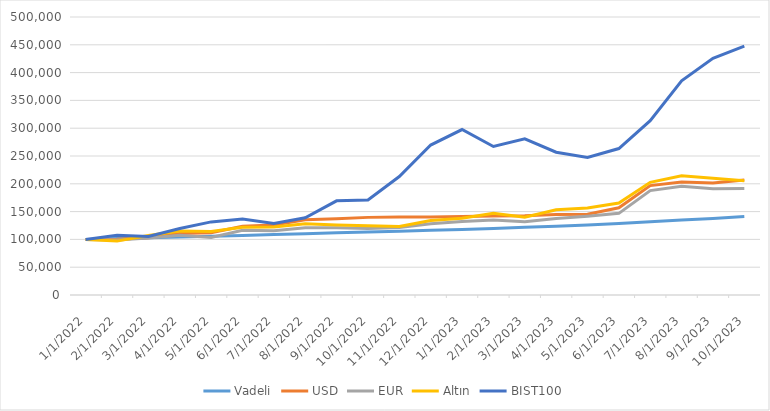
| Category | Vadeli | USD | EUR | Altın | BIST100 |
|---|---|---|---|---|---|
| 1/1/22 | 100000 | 100000 | 100000 | 100000 | 100000 |
| 2/1/22 | 101500 | 100406.599 | 98841.487 | 96932.856 | 107626.987 |
| 3/1/22 | 102937.917 | 102916.349 | 102496.681 | 106926.062 | 105230.728 |
| 4/1/22 | 104310.422 | 110745.834 | 107243.017 | 115162.671 | 119638.21 |
| 5/1/22 | 105701.228 | 112105.188 | 103373.161 | 114181.715 | 131505.678 |
| 6/1/22 | 107110.578 | 123768.321 | 116297.118 | 122012.228 | 136501.269 |
| 7/1/22 | 108627.977 | 125941.628 | 115608.88 | 122288.126 | 128718.236 |
| 8/1/22 | 110257.397 | 135138.764 | 120886.916 | 128201.218 | 138959.519 |
| 9/1/22 | 111819.377 | 137255.494 | 120857.194 | 125994.033 | 169320.508 |
| 10/1/22 | 113310.302 | 139613.618 | 119692.737 | 124489.765 | 170784.77 |
| 11/1/22 | 114821.106 | 140419.272 | 121537.506 | 123186.024 | 213089.646 |
| 12/1/22 | 116352.054 | 140251.805 | 127936.407 | 133926.134 | 269675.351 |
| 1/1/23 | 118000.375 | 141054.442 | 132197.938 | 138181.19 | 297578.09 |
| 2/1/23 | 119770.38 | 141894.797 | 134984.577 | 146940.229 | 267138.009 |
| 3/1/23 | 121666.745 | 142477.162 | 131919.208 | 139720.749 | 281028.19 |
| 4/1/23 | 123694.524 | 144733.447 | 137413.227 | 153145.099 | 256855.043 |
| 5/1/23 | 125859.178 | 145380.687 | 141541.998 | 156646.194 | 247340.548 |
| 6/1/23 | 128376.362 | 156923.878 | 146859.004 | 165414.811 | 263387.041 |
| 7/1/23 | 131799.731 | 196739.663 | 187758.337 | 202624.246 | 313546.025 |
| 8/1/23 | 134765.225 | 203215.829 | 195605.049 | 214360.185 | 385282.031 |
| 9/1/23 | 137572.834 | 201366.897 | 191131.498 | 209927.414 | 425739.479 |
| 10/1/23 | 141241.443 | 206725.859 | 191465.71 | 205443.598 | 447540.414 |